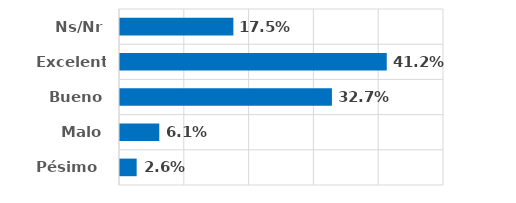
| Category | Series 0 |
|---|---|
| Pésimo  | 0.026 |
| Malo | 0.061 |
| Bueno | 0.327 |
| Excelente | 0.412 |
| Ns/Nr | 0.175 |